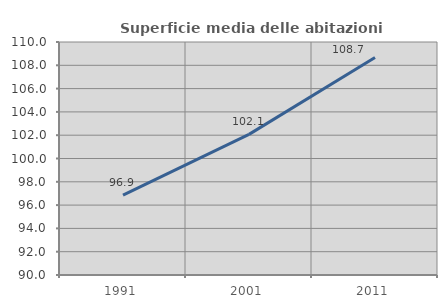
| Category | Superficie media delle abitazioni occupate |
|---|---|
| 1991.0 | 96.864 |
| 2001.0 | 102.069 |
| 2011.0 | 108.669 |